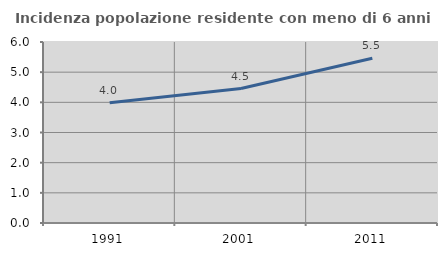
| Category | Incidenza popolazione residente con meno di 6 anni |
|---|---|
| 1991.0 | 3.986 |
| 2001.0 | 4.458 |
| 2011.0 | 5.46 |